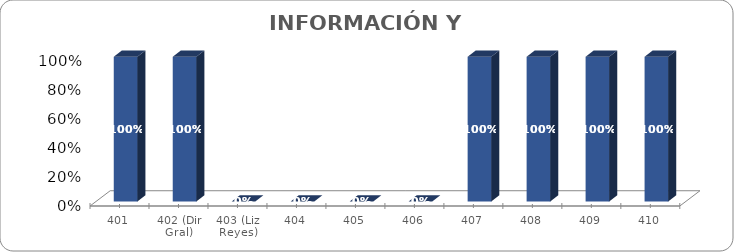
| Category | % Avance |
|---|---|
| 401 | 1 |
| 402 (Dir Gral) | 1 |
| 403 (Liz Reyes) | 0 |
| 404 | 0 |
| 405 | 0 |
| 406 | 0 |
| 407 | 1 |
| 408 | 1 |
| 409 | 1 |
| 410 | 1 |